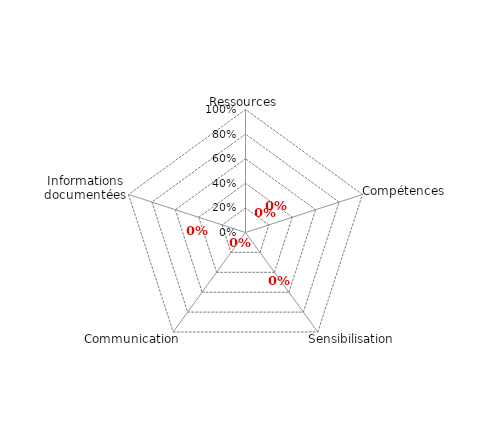
| Category | Article 7 |
|---|---|
| 0 | 0 |
| 1 | 0 |
| 2 | 0 |
| 3 | 0 |
| 4 | 0 |